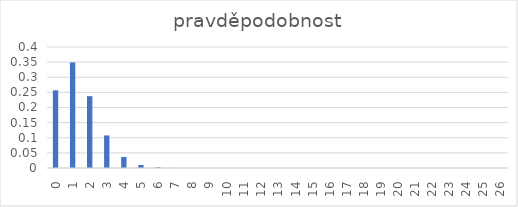
| Category | pravděpodobnost |
|---|---|
| 0.0 | 0.257 |
| 1.0 | 0.349 |
| 2.0 | 0.237 |
| 3.0 | 0.108 |
| 4.0 | 0.037 |
| 5.0 | 0.01 |
| 6.0 | 0.002 |
| 7.0 | 0 |
| 8.0 | 0 |
| 9.0 | 0 |
| 10.0 | 0 |
| 11.0 | 0 |
| 12.0 | 0 |
| 13.0 | 0 |
| 14.0 | 0 |
| 15.0 | 0 |
| 16.0 | 0 |
| 17.0 | 0 |
| 18.0 | 0 |
| 19.0 | 0 |
| 20.0 | 0 |
| 21.0 | 0 |
| 22.0 | 0 |
| 23.0 | 0 |
| 24.0 | 0 |
| 25.0 | 0 |
| 26.0 | 0 |